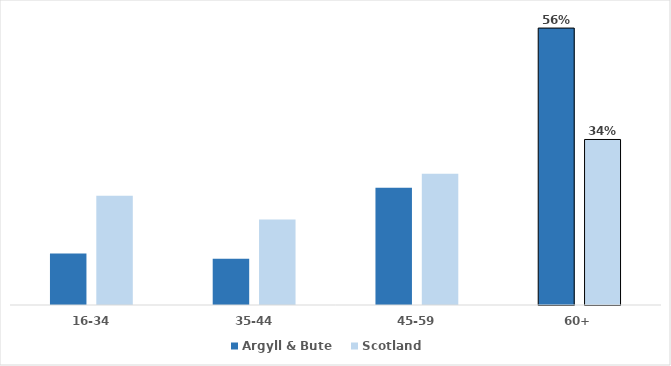
| Category | Argyll & Bute | Scotland |
|---|---|---|
| 16-34 | 0.105 | 0.222 |
| 35-44 | 0.094 | 0.174 |
| 45-59 | 0.238 | 0.267 |
| 60+ | 0.563 | 0.337 |